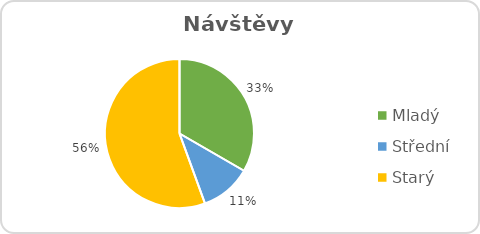
| Category | Mladý |
|---|---|
| Mladý | 3 |
| Střední | 1 |
| Starý | 5 |